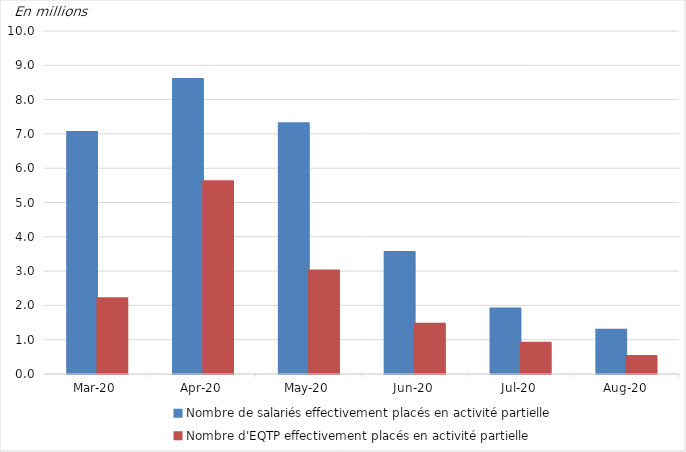
| Category | Nombre de salariés effectivement placés en activité partielle | Nombre d'EQTP effectivement placés en activité partielle |
|---|---|---|
| 2020-03-01 | 7.037 | 2.195 |
| 2020-04-01 | 8.588 | 5.607 |
| 2020-05-01 | 7.295 | 3.006 |
| 2020-06-01 | 3.545 | 1.452 |
| 2020-07-01 | 1.894 | 0.9 |
| 2020-08-01 | 1.274 | 0.514 |